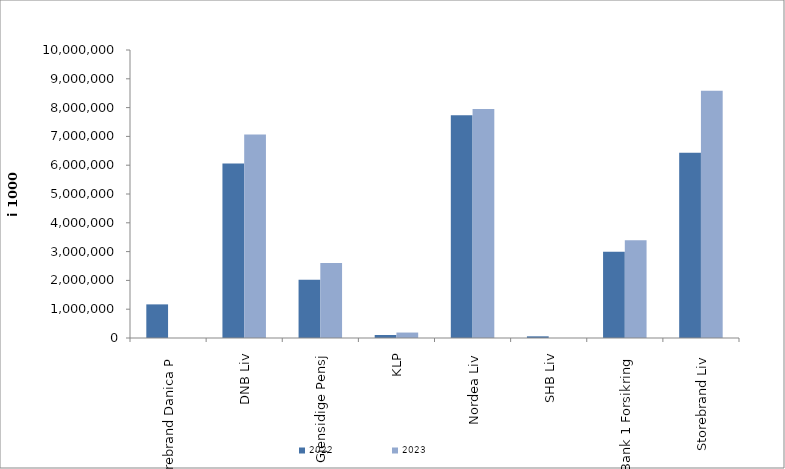
| Category | 2022 | 2023 |
|---|---|---|
| Storebrand Danica P | 1167273.505 | 0 |
| DNB Liv | 6060306.909 | 7066194.906 |
| Gjensidige Pensj | 2022284 | 2603075 |
| KLP | 103293.625 | 189248.239 |
| Nordea Liv | 7731556.819 | 7948920.378 |
| SHB Liv | 57940.99 | 0 |
| SpareBank 1 Forsikring | 2999062.731 | 3397452.466 |
| Storebrand Liv | 6429774.228 | 8584720.523 |